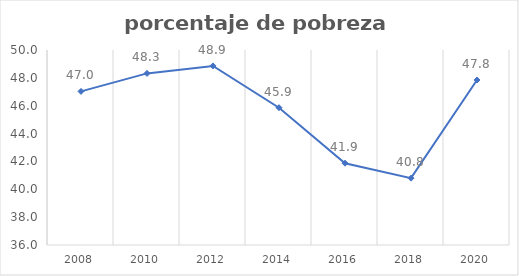
| Category | Series 0 |
|---|---|
| 2008.0 | 47.027 |
| 2010.0 | 48.321 |
| 2012.0 | 48.857 |
| 2014.0 | 45.857 |
| 2016.0 | 41.872 |
| 2018.0 | 40.798 |
| 2020.0 | 47.844 |